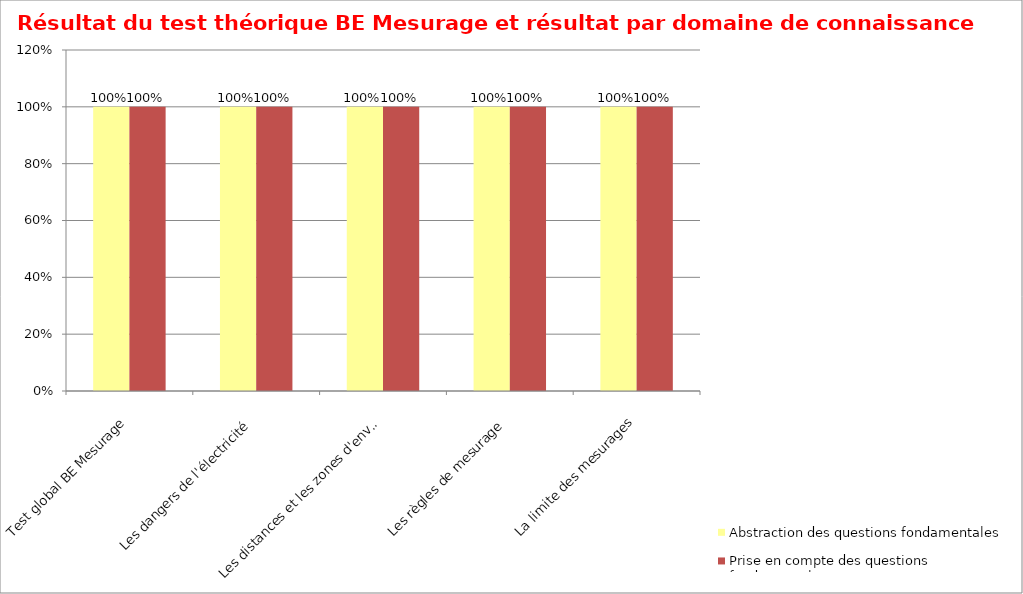
| Category | Abstraction des questions fondamentales | Prise en compte des questions fondamentales |
|---|---|---|
| Test global BE Mesurage | 1 | 1 |
| Les dangers de l'électricité | 1 | 1 |
| Les distances et les zones d'environnement | 1 | 1 |
| Les règles de mesurage | 1 | 1 |
| La limite des mesurages | 1 | 1 |